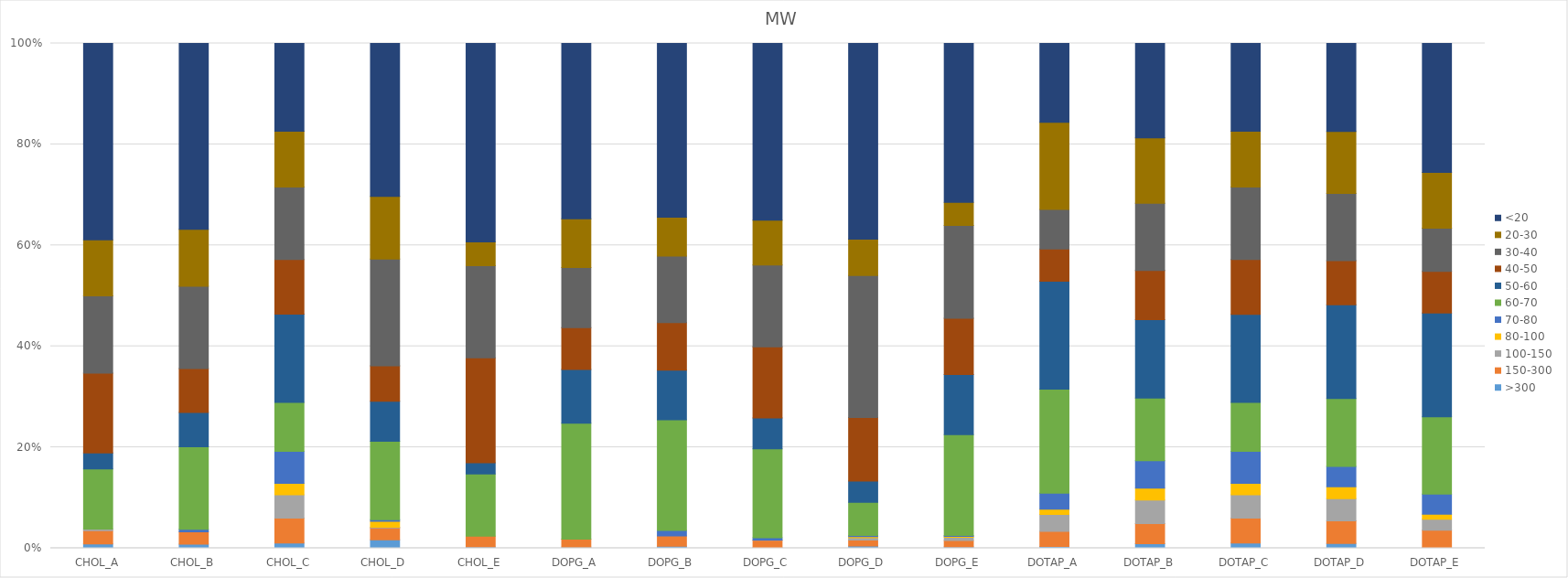
| Category | >300 | 150-300 | 100-150 | 80-100 | 70-80 | 60-70 | 50-60 | 40-50 | 30-40 | 20-30 | <20 |
|---|---|---|---|---|---|---|---|---|---|---|---|
| CHOL_A | 0.009 | 0.026 | 0.003 | 0 | 0 | 0.119 | 0.032 | 0.158 | 0.153 | 0.111 | 0.389 |
| CHOL_B | 0.008 | 0.025 | 0 | 0 | 0.005 | 0.163 | 0.068 | 0.087 | 0.163 | 0.113 | 0.368 |
| CHOL_C | 0.01 | 0.05 | 0.046 | 0.023 | 0.063 | 0.097 | 0.174 | 0.108 | 0.144 | 0.111 | 0.174 |
| CHOL_D | 0.017 | 0.024 | 0.001 | 0.012 | 0.003 | 0.155 | 0.079 | 0.07 | 0.212 | 0.124 | 0.303 |
| CHOL_E | 0.003 | 0.022 | 0 | 0 | 0 | 0.123 | 0.022 | 0.208 | 0.183 | 0.047 | 0.393 |
| DOPG_A | 0.002 | 0.016 | 0 | 0 | 0 | 0.229 | 0.106 | 0.083 | 0.119 | 0.096 | 0.348 |
| DOPG_B | 0.004 | 0.02 | 0 | 0 | 0.011 | 0.219 | 0.098 | 0.094 | 0.132 | 0.077 | 0.344 |
| DOPG_C | 0.001 | 0.015 | 0.001 | 0 | 0.004 | 0.176 | 0.061 | 0.141 | 0.162 | 0.089 | 0.35 |
| DOPG_D | 0.005 | 0.012 | 0.004 | 0.002 | 0.002 | 0.066 | 0.042 | 0.126 | 0.281 | 0.072 | 0.388 |
| DOPG_E | 0.003 | 0.013 | 0.006 | 0.002 | 0.002 | 0.2 | 0.119 | 0.111 | 0.184 | 0.046 | 0.315 |
| DOTAP_A | 0.004 | 0.03 | 0.033 | 0.01 | 0.032 | 0.206 | 0.214 | 0.064 | 0.078 | 0.172 | 0.156 |
| DOTAP_B | 0.009 | 0.04 | 0.046 | 0.024 | 0.054 | 0.124 | 0.155 | 0.097 | 0.133 | 0.13 | 0.187 |
| DOTAP_C | 0.01 | 0.05 | 0.046 | 0.023 | 0.063 | 0.097 | 0.175 | 0.108 | 0.144 | 0.111 | 0.174 |
| DOTAP_D | 0.01 | 0.045 | 0.044 | 0.024 | 0.04 | 0.134 | 0.186 | 0.088 | 0.133 | 0.123 | 0.174 |
| DOTAP_E | 0.001 | 0.034 | 0.022 | 0.01 | 0.04 | 0.153 | 0.206 | 0.082 | 0.085 | 0.11 | 0.256 |